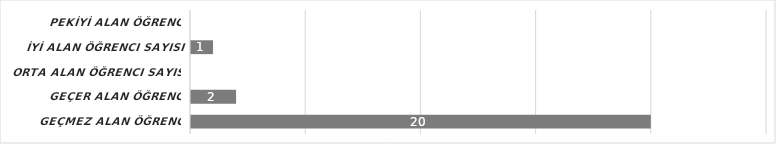
| Category | Series 6 |
|---|---|
| GEÇMEZ alan öğrenci sayısı | 20 |
| GEÇER alan öğrenci sayısı | 2 |
| ORTA alan öğrenci sayısı | 0 |
| İYİ alan öğrenci sayısı | 1 |
| PEKİYİ alan öğrenci sayısı | 0 |